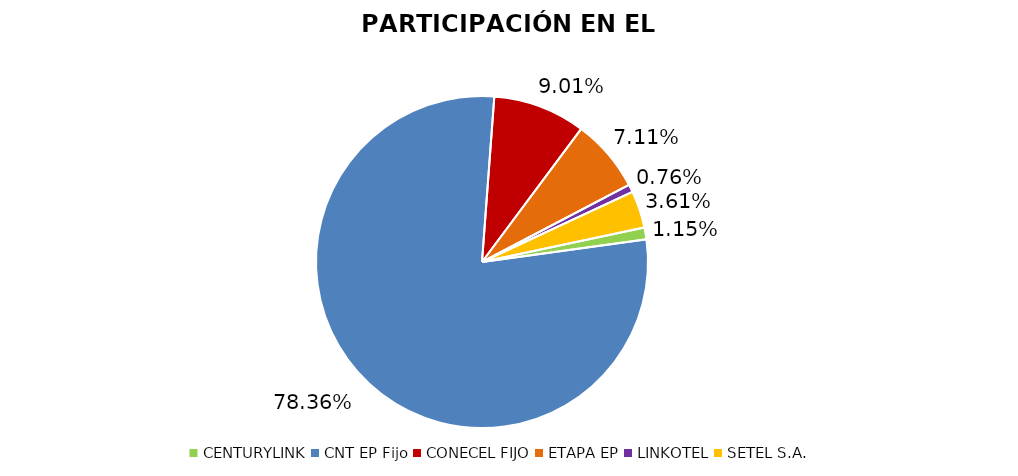
| Category | Participación en el Mercado |
|---|---|
| CENTURYLINK | 0.012 |
| CNT EP Fijo | 0.784 |
| CONECEL FIJO | 0.09 |
| ETAPA EP | 0.071 |
| LINKOTEL | 0.008 |
| SETEL S.A. | 0.036 |